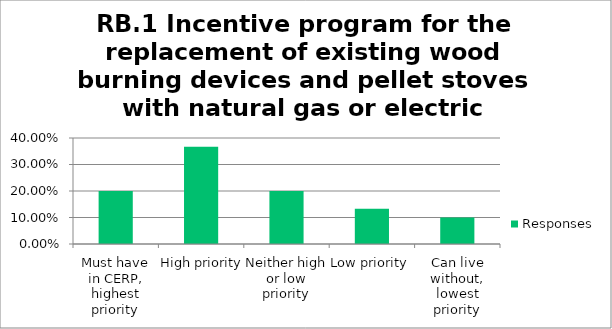
| Category | Responses |
|---|---|
| Must have in CERP, highest priority | 0.2 |
| High priority | 0.367 |
| Neither high or low priority | 0.2 |
| Low priority | 0.133 |
| Can live without, lowest priority | 0.1 |